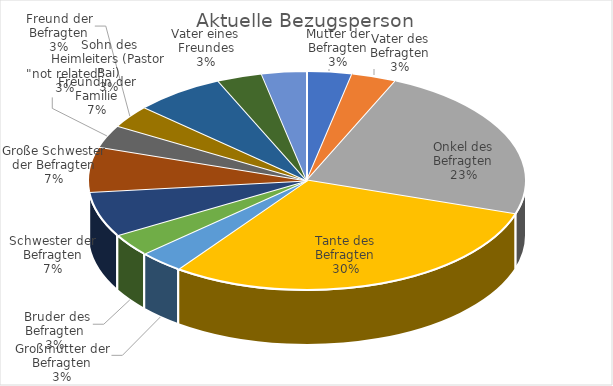
| Category | Series 0 |
|---|---|
| Mutter der Befragten | 1 |
| Vater des Befragten | 1 |
| Onkel des Befragten | 7 |
| Tante des Befragten | 9 |
| Großmutter der Befragten | 1 |
|  Bruder des Befragten | 1 |
| Schwester der Befragten | 2 |
| Große Schwester der Befragten | 2 |
| "not related" | 1 |
| Freund der Befragten | 1 |
| Freundin der Familie | 2 |
| Sohn des Heimleiters (Pastor Bai) | 1 |
| Vater eines Freundes | 1 |